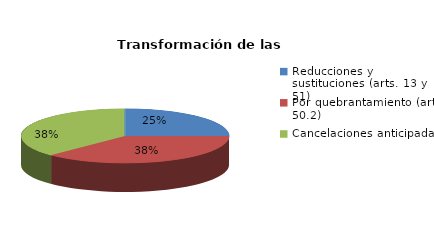
| Category | Series 0 |
|---|---|
| Reducciones y sustituciones (arts. 13 y 51) | 2 |
| Por quebrantamiento (art. 50.2) | 3 |
| Cancelaciones anticipadas | 3 |
| Traslado a Centros Penitenciarios | 0 |
| Conversión internamientos en cerrados (art. 51.2) | 0 |